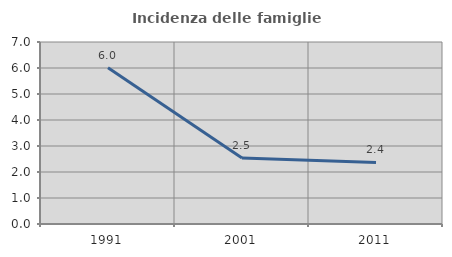
| Category | Incidenza delle famiglie numerose |
|---|---|
| 1991.0 | 6.007 |
| 2001.0 | 2.54 |
| 2011.0 | 2.366 |